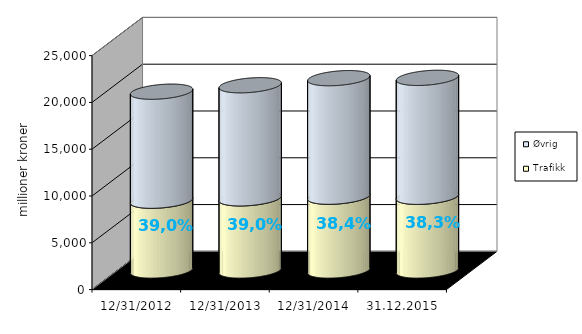
| Category | Trafikk | Øvrig |
|---|---|---|
| 31.12.2012 | 7457.552 | 11647.433 |
| 31.12.2013 | 7709.892 | 12083.527 |
| 31.12.2014 | 7884.668 | 12665.925 |
| 31.12.2015 | 7875.825 | 12707.863 |